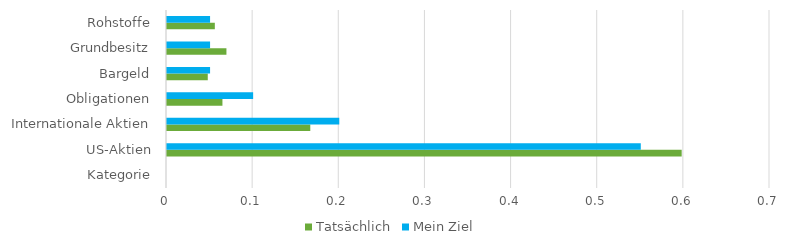
| Category | Tatsächlich | Mein Ziel |
|---|---|---|
| Kategorie | 0 | 0 |
| US-Aktien | 0.597 | 0.55 |
| Internationale Aktien | 0.166 | 0.2 |
| Obligationen | 0.064 | 0.1 |
| Bargeld | 0.047 | 0.05 |
| Grundbesitz | 0.069 | 0.05 |
| Rohstoffe | 0.056 | 0.05 |